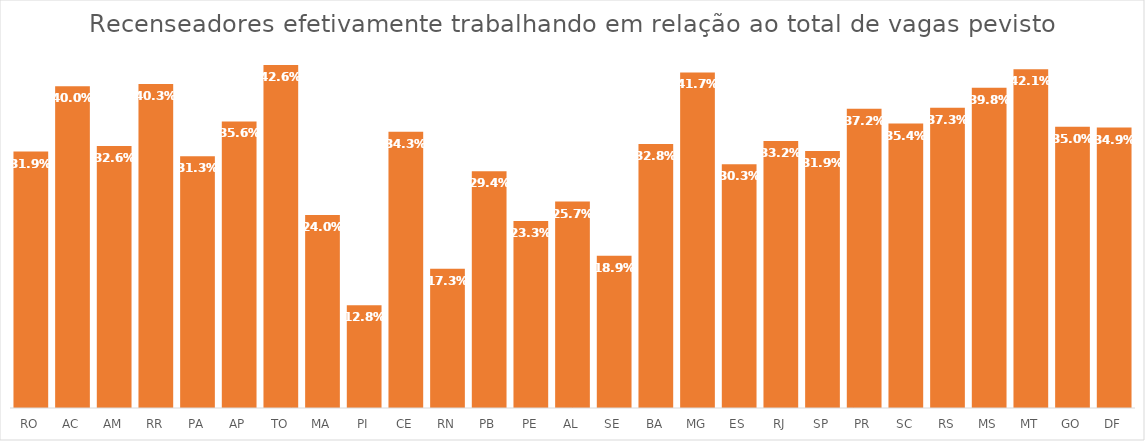
| Category | Trabalhando |
|---|---|
| RO | 0.319 |
| AC | 0.4 |
| AM | 0.326 |
| RR | 0.403 |
| PA | 0.313 |
| AP | 0.356 |
| TO | 0.426 |
| MA | 0.24 |
| PI | 0.128 |
| CE | 0.343 |
| RN | 0.173 |
| PB | 0.294 |
| PE | 0.233 |
| AL | 0.257 |
| SE | 0.189 |
| BA | 0.328 |
| MG | 0.417 |
| ES | 0.303 |
| RJ | 0.332 |
| SP | 0.319 |
| PR | 0.372 |
| SC | 0.354 |
| RS | 0.373 |
| MS | 0.398 |
| MT | 0.421 |
| GO | 0.35 |
| DF | 0.349 |